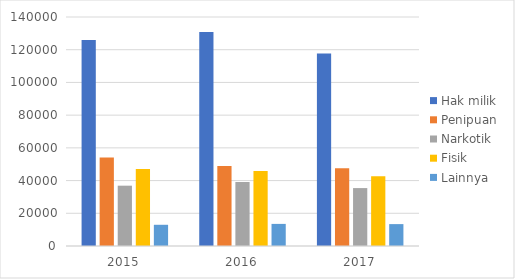
| Category | Hak milik | Penipuan | Narkotik | Fisik | Lainnya |
|---|---|---|---|---|---|
| 2015.0 | 125869 | 54115 | 36874 | 47128 | 12968 |
| 2016.0 | 130851 | 48833 | 39160 | 45892 | 13512 |
| 2017.0 | 117734 | 47594 | 35412 | 42683 | 13383 |